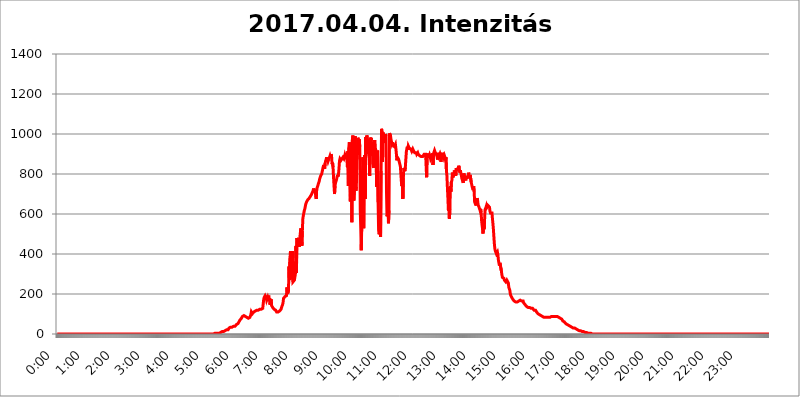
| Category | 2017.04.04. Intenzitás [W/m^2] |
|---|---|
| 0.0 | 0 |
| 0.0006944444444444445 | 0 |
| 0.001388888888888889 | 0 |
| 0.0020833333333333333 | 0 |
| 0.002777777777777778 | 0 |
| 0.003472222222222222 | 0 |
| 0.004166666666666667 | 0 |
| 0.004861111111111111 | 0 |
| 0.005555555555555556 | 0 |
| 0.0062499999999999995 | 0 |
| 0.006944444444444444 | 0 |
| 0.007638888888888889 | 0 |
| 0.008333333333333333 | 0 |
| 0.009027777777777779 | 0 |
| 0.009722222222222222 | 0 |
| 0.010416666666666666 | 0 |
| 0.011111111111111112 | 0 |
| 0.011805555555555555 | 0 |
| 0.012499999999999999 | 0 |
| 0.013194444444444444 | 0 |
| 0.013888888888888888 | 0 |
| 0.014583333333333332 | 0 |
| 0.015277777777777777 | 0 |
| 0.015972222222222224 | 0 |
| 0.016666666666666666 | 0 |
| 0.017361111111111112 | 0 |
| 0.018055555555555557 | 0 |
| 0.01875 | 0 |
| 0.019444444444444445 | 0 |
| 0.02013888888888889 | 0 |
| 0.020833333333333332 | 0 |
| 0.02152777777777778 | 0 |
| 0.022222222222222223 | 0 |
| 0.02291666666666667 | 0 |
| 0.02361111111111111 | 0 |
| 0.024305555555555556 | 0 |
| 0.024999999999999998 | 0 |
| 0.025694444444444447 | 0 |
| 0.02638888888888889 | 0 |
| 0.027083333333333334 | 0 |
| 0.027777777777777776 | 0 |
| 0.02847222222222222 | 0 |
| 0.029166666666666664 | 0 |
| 0.029861111111111113 | 0 |
| 0.030555555555555555 | 0 |
| 0.03125 | 0 |
| 0.03194444444444445 | 0 |
| 0.03263888888888889 | 0 |
| 0.03333333333333333 | 0 |
| 0.034027777777777775 | 0 |
| 0.034722222222222224 | 0 |
| 0.035416666666666666 | 0 |
| 0.036111111111111115 | 0 |
| 0.03680555555555556 | 0 |
| 0.0375 | 0 |
| 0.03819444444444444 | 0 |
| 0.03888888888888889 | 0 |
| 0.03958333333333333 | 0 |
| 0.04027777777777778 | 0 |
| 0.04097222222222222 | 0 |
| 0.041666666666666664 | 0 |
| 0.042361111111111106 | 0 |
| 0.04305555555555556 | 0 |
| 0.043750000000000004 | 0 |
| 0.044444444444444446 | 0 |
| 0.04513888888888889 | 0 |
| 0.04583333333333334 | 0 |
| 0.04652777777777778 | 0 |
| 0.04722222222222222 | 0 |
| 0.04791666666666666 | 0 |
| 0.04861111111111111 | 0 |
| 0.049305555555555554 | 0 |
| 0.049999999999999996 | 0 |
| 0.05069444444444445 | 0 |
| 0.051388888888888894 | 0 |
| 0.052083333333333336 | 0 |
| 0.05277777777777778 | 0 |
| 0.05347222222222222 | 0 |
| 0.05416666666666667 | 0 |
| 0.05486111111111111 | 0 |
| 0.05555555555555555 | 0 |
| 0.05625 | 0 |
| 0.05694444444444444 | 0 |
| 0.057638888888888885 | 0 |
| 0.05833333333333333 | 0 |
| 0.05902777777777778 | 0 |
| 0.059722222222222225 | 0 |
| 0.06041666666666667 | 0 |
| 0.061111111111111116 | 0 |
| 0.06180555555555556 | 0 |
| 0.0625 | 0 |
| 0.06319444444444444 | 0 |
| 0.06388888888888888 | 0 |
| 0.06458333333333334 | 0 |
| 0.06527777777777778 | 0 |
| 0.06597222222222222 | 0 |
| 0.06666666666666667 | 0 |
| 0.06736111111111111 | 0 |
| 0.06805555555555555 | 0 |
| 0.06874999999999999 | 0 |
| 0.06944444444444443 | 0 |
| 0.07013888888888889 | 0 |
| 0.07083333333333333 | 0 |
| 0.07152777777777779 | 0 |
| 0.07222222222222223 | 0 |
| 0.07291666666666667 | 0 |
| 0.07361111111111111 | 0 |
| 0.07430555555555556 | 0 |
| 0.075 | 0 |
| 0.07569444444444444 | 0 |
| 0.0763888888888889 | 0 |
| 0.07708333333333334 | 0 |
| 0.07777777777777778 | 0 |
| 0.07847222222222222 | 0 |
| 0.07916666666666666 | 0 |
| 0.0798611111111111 | 0 |
| 0.08055555555555556 | 0 |
| 0.08125 | 0 |
| 0.08194444444444444 | 0 |
| 0.08263888888888889 | 0 |
| 0.08333333333333333 | 0 |
| 0.08402777777777777 | 0 |
| 0.08472222222222221 | 0 |
| 0.08541666666666665 | 0 |
| 0.08611111111111112 | 0 |
| 0.08680555555555557 | 0 |
| 0.08750000000000001 | 0 |
| 0.08819444444444445 | 0 |
| 0.08888888888888889 | 0 |
| 0.08958333333333333 | 0 |
| 0.09027777777777778 | 0 |
| 0.09097222222222222 | 0 |
| 0.09166666666666667 | 0 |
| 0.09236111111111112 | 0 |
| 0.09305555555555556 | 0 |
| 0.09375 | 0 |
| 0.09444444444444444 | 0 |
| 0.09513888888888888 | 0 |
| 0.09583333333333333 | 0 |
| 0.09652777777777777 | 0 |
| 0.09722222222222222 | 0 |
| 0.09791666666666667 | 0 |
| 0.09861111111111111 | 0 |
| 0.09930555555555555 | 0 |
| 0.09999999999999999 | 0 |
| 0.10069444444444443 | 0 |
| 0.1013888888888889 | 0 |
| 0.10208333333333335 | 0 |
| 0.10277777777777779 | 0 |
| 0.10347222222222223 | 0 |
| 0.10416666666666667 | 0 |
| 0.10486111111111111 | 0 |
| 0.10555555555555556 | 0 |
| 0.10625 | 0 |
| 0.10694444444444444 | 0 |
| 0.1076388888888889 | 0 |
| 0.10833333333333334 | 0 |
| 0.10902777777777778 | 0 |
| 0.10972222222222222 | 0 |
| 0.1111111111111111 | 0 |
| 0.11180555555555556 | 0 |
| 0.11180555555555556 | 0 |
| 0.1125 | 0 |
| 0.11319444444444444 | 0 |
| 0.11388888888888889 | 0 |
| 0.11458333333333333 | 0 |
| 0.11527777777777777 | 0 |
| 0.11597222222222221 | 0 |
| 0.11666666666666665 | 0 |
| 0.1173611111111111 | 0 |
| 0.11805555555555557 | 0 |
| 0.11944444444444445 | 0 |
| 0.12013888888888889 | 0 |
| 0.12083333333333333 | 0 |
| 0.12152777777777778 | 0 |
| 0.12222222222222223 | 0 |
| 0.12291666666666667 | 0 |
| 0.12291666666666667 | 0 |
| 0.12361111111111112 | 0 |
| 0.12430555555555556 | 0 |
| 0.125 | 0 |
| 0.12569444444444444 | 0 |
| 0.12638888888888888 | 0 |
| 0.12708333333333333 | 0 |
| 0.16875 | 0 |
| 0.12847222222222224 | 0 |
| 0.12916666666666668 | 0 |
| 0.12986111111111112 | 0 |
| 0.13055555555555556 | 0 |
| 0.13125 | 0 |
| 0.13194444444444445 | 0 |
| 0.1326388888888889 | 0 |
| 0.13333333333333333 | 0 |
| 0.13402777777777777 | 0 |
| 0.13402777777777777 | 0 |
| 0.13472222222222222 | 0 |
| 0.13541666666666666 | 0 |
| 0.1361111111111111 | 0 |
| 0.13749999999999998 | 0 |
| 0.13819444444444443 | 0 |
| 0.1388888888888889 | 0 |
| 0.13958333333333334 | 0 |
| 0.14027777777777778 | 0 |
| 0.14097222222222222 | 0 |
| 0.14166666666666666 | 0 |
| 0.1423611111111111 | 0 |
| 0.14305555555555557 | 0 |
| 0.14375000000000002 | 0 |
| 0.14444444444444446 | 0 |
| 0.1451388888888889 | 0 |
| 0.1451388888888889 | 0 |
| 0.14652777777777778 | 0 |
| 0.14722222222222223 | 0 |
| 0.14791666666666667 | 0 |
| 0.1486111111111111 | 0 |
| 0.14930555555555555 | 0 |
| 0.15 | 0 |
| 0.15069444444444444 | 0 |
| 0.15138888888888888 | 0 |
| 0.15208333333333332 | 0 |
| 0.15277777777777776 | 0 |
| 0.15347222222222223 | 0 |
| 0.15416666666666667 | 0 |
| 0.15486111111111112 | 0 |
| 0.15555555555555556 | 0 |
| 0.15625 | 0 |
| 0.15694444444444444 | 0 |
| 0.15763888888888888 | 0 |
| 0.15833333333333333 | 0 |
| 0.15902777777777777 | 0 |
| 0.15972222222222224 | 0 |
| 0.16041666666666668 | 0 |
| 0.16111111111111112 | 0 |
| 0.16180555555555556 | 0 |
| 0.1625 | 0 |
| 0.16319444444444445 | 0 |
| 0.1638888888888889 | 0 |
| 0.16458333333333333 | 0 |
| 0.16527777777777777 | 0 |
| 0.16597222222222222 | 0 |
| 0.16666666666666666 | 0 |
| 0.1673611111111111 | 0 |
| 0.16805555555555554 | 0 |
| 0.16874999999999998 | 0 |
| 0.16944444444444443 | 0 |
| 0.17013888888888887 | 0 |
| 0.1708333333333333 | 0 |
| 0.17152777777777775 | 0 |
| 0.17222222222222225 | 0 |
| 0.1729166666666667 | 0 |
| 0.17361111111111113 | 0 |
| 0.17430555555555557 | 0 |
| 0.17500000000000002 | 0 |
| 0.17569444444444446 | 0 |
| 0.1763888888888889 | 0 |
| 0.17708333333333334 | 0 |
| 0.17777777777777778 | 0 |
| 0.17847222222222223 | 0 |
| 0.17916666666666667 | 0 |
| 0.1798611111111111 | 0 |
| 0.18055555555555555 | 0 |
| 0.18125 | 0 |
| 0.18194444444444444 | 0 |
| 0.1826388888888889 | 0 |
| 0.18333333333333335 | 0 |
| 0.1840277777777778 | 0 |
| 0.18472222222222223 | 0 |
| 0.18541666666666667 | 0 |
| 0.18611111111111112 | 0 |
| 0.18680555555555556 | 0 |
| 0.1875 | 0 |
| 0.18819444444444444 | 0 |
| 0.18888888888888888 | 0 |
| 0.18958333333333333 | 0 |
| 0.19027777777777777 | 0 |
| 0.1909722222222222 | 0 |
| 0.19166666666666665 | 0 |
| 0.19236111111111112 | 0 |
| 0.19305555555555554 | 0 |
| 0.19375 | 0 |
| 0.19444444444444445 | 0 |
| 0.1951388888888889 | 0 |
| 0.19583333333333333 | 0 |
| 0.19652777777777777 | 0 |
| 0.19722222222222222 | 0 |
| 0.19791666666666666 | 0 |
| 0.1986111111111111 | 0 |
| 0.19930555555555554 | 0 |
| 0.19999999999999998 | 0 |
| 0.20069444444444443 | 0 |
| 0.20138888888888887 | 0 |
| 0.2020833333333333 | 0 |
| 0.2027777777777778 | 0 |
| 0.2034722222222222 | 0 |
| 0.2041666666666667 | 0 |
| 0.20486111111111113 | 0 |
| 0.20555555555555557 | 0 |
| 0.20625000000000002 | 0 |
| 0.20694444444444446 | 0 |
| 0.2076388888888889 | 0 |
| 0.20833333333333334 | 0 |
| 0.20902777777777778 | 0 |
| 0.20972222222222223 | 0 |
| 0.21041666666666667 | 0 |
| 0.2111111111111111 | 0 |
| 0.21180555555555555 | 0 |
| 0.2125 | 0 |
| 0.21319444444444444 | 0 |
| 0.2138888888888889 | 0 |
| 0.21458333333333335 | 0 |
| 0.2152777777777778 | 0 |
| 0.21597222222222223 | 0 |
| 0.21666666666666667 | 0 |
| 0.21736111111111112 | 0 |
| 0.21805555555555556 | 0 |
| 0.21875 | 0 |
| 0.21944444444444444 | 0 |
| 0.22013888888888888 | 3.525 |
| 0.22083333333333333 | 3.525 |
| 0.22152777777777777 | 3.525 |
| 0.2222222222222222 | 3.525 |
| 0.22291666666666665 | 3.525 |
| 0.2236111111111111 | 3.525 |
| 0.22430555555555556 | 3.525 |
| 0.225 | 3.525 |
| 0.22569444444444445 | 3.525 |
| 0.2263888888888889 | 3.525 |
| 0.22708333333333333 | 3.525 |
| 0.22777777777777777 | 3.525 |
| 0.22847222222222222 | 7.887 |
| 0.22916666666666666 | 7.887 |
| 0.2298611111111111 | 7.887 |
| 0.23055555555555554 | 12.257 |
| 0.23124999999999998 | 12.257 |
| 0.23194444444444443 | 12.257 |
| 0.23263888888888887 | 12.257 |
| 0.2333333333333333 | 12.257 |
| 0.2340277777777778 | 12.257 |
| 0.2347222222222222 | 16.636 |
| 0.2354166666666667 | 16.636 |
| 0.23611111111111113 | 16.636 |
| 0.23680555555555557 | 16.636 |
| 0.23750000000000002 | 21.024 |
| 0.23819444444444446 | 21.024 |
| 0.2388888888888889 | 21.024 |
| 0.23958333333333334 | 21.024 |
| 0.24027777777777778 | 25.419 |
| 0.24097222222222223 | 29.823 |
| 0.24166666666666667 | 29.823 |
| 0.2423611111111111 | 29.823 |
| 0.24305555555555555 | 34.234 |
| 0.24375 | 34.234 |
| 0.24444444444444446 | 34.234 |
| 0.24513888888888888 | 34.234 |
| 0.24583333333333335 | 34.234 |
| 0.2465277777777778 | 38.653 |
| 0.24722222222222223 | 38.653 |
| 0.24791666666666667 | 38.653 |
| 0.24861111111111112 | 38.653 |
| 0.24930555555555556 | 38.653 |
| 0.25 | 43.079 |
| 0.25069444444444444 | 43.079 |
| 0.2513888888888889 | 47.511 |
| 0.2520833333333333 | 47.511 |
| 0.25277777777777777 | 51.951 |
| 0.2534722222222222 | 51.951 |
| 0.25416666666666665 | 56.398 |
| 0.2548611111111111 | 60.85 |
| 0.2555555555555556 | 65.31 |
| 0.25625000000000003 | 69.775 |
| 0.2569444444444445 | 74.246 |
| 0.2576388888888889 | 74.246 |
| 0.25833333333333336 | 78.722 |
| 0.2590277777777778 | 83.205 |
| 0.25972222222222224 | 87.692 |
| 0.2604166666666667 | 87.692 |
| 0.2611111111111111 | 92.184 |
| 0.26180555555555557 | 92.184 |
| 0.2625 | 92.184 |
| 0.26319444444444445 | 92.184 |
| 0.2638888888888889 | 87.692 |
| 0.26458333333333334 | 87.692 |
| 0.2652777777777778 | 83.205 |
| 0.2659722222222222 | 83.205 |
| 0.26666666666666666 | 83.205 |
| 0.2673611111111111 | 83.205 |
| 0.26805555555555555 | 78.722 |
| 0.26875 | 78.722 |
| 0.26944444444444443 | 83.205 |
| 0.2701388888888889 | 83.205 |
| 0.2708333333333333 | 87.692 |
| 0.27152777777777776 | 96.682 |
| 0.2722222222222222 | 110.201 |
| 0.27291666666666664 | 105.69 |
| 0.2736111111111111 | 101.184 |
| 0.2743055555555555 | 101.184 |
| 0.27499999999999997 | 105.69 |
| 0.27569444444444446 | 110.201 |
| 0.27638888888888885 | 110.201 |
| 0.27708333333333335 | 114.716 |
| 0.2777777777777778 | 114.716 |
| 0.27847222222222223 | 114.716 |
| 0.2791666666666667 | 119.235 |
| 0.2798611111111111 | 119.235 |
| 0.28055555555555556 | 119.235 |
| 0.28125 | 119.235 |
| 0.28194444444444444 | 119.235 |
| 0.2826388888888889 | 119.235 |
| 0.2833333333333333 | 119.235 |
| 0.28402777777777777 | 123.758 |
| 0.2847222222222222 | 119.235 |
| 0.28541666666666665 | 119.235 |
| 0.28611111111111115 | 123.758 |
| 0.28680555555555554 | 123.758 |
| 0.28750000000000003 | 128.284 |
| 0.2881944444444445 | 128.284 |
| 0.2888888888888889 | 132.814 |
| 0.28958333333333336 | 173.709 |
| 0.2902777777777778 | 182.82 |
| 0.29097222222222224 | 187.378 |
| 0.2916666666666667 | 191.937 |
| 0.2923611111111111 | 191.937 |
| 0.29305555555555557 | 182.82 |
| 0.29375 | 169.156 |
| 0.29444444444444445 | 169.156 |
| 0.2951388888888889 | 182.82 |
| 0.29583333333333334 | 173.709 |
| 0.2965277777777778 | 191.937 |
| 0.2972222222222222 | 164.605 |
| 0.29791666666666666 | 178.264 |
| 0.2986111111111111 | 146.423 |
| 0.29930555555555555 | 164.605 |
| 0.3 | 173.709 |
| 0.30069444444444443 | 141.884 |
| 0.3013888888888889 | 137.347 |
| 0.3020833333333333 | 132.814 |
| 0.30277777777777776 | 128.284 |
| 0.3034722222222222 | 128.284 |
| 0.30416666666666664 | 123.758 |
| 0.3048611111111111 | 119.235 |
| 0.3055555555555555 | 119.235 |
| 0.30624999999999997 | 119.235 |
| 0.3069444444444444 | 114.716 |
| 0.3076388888888889 | 110.201 |
| 0.30833333333333335 | 110.201 |
| 0.3090277777777778 | 110.201 |
| 0.30972222222222223 | 110.201 |
| 0.3104166666666667 | 110.201 |
| 0.3111111111111111 | 110.201 |
| 0.31180555555555556 | 114.716 |
| 0.3125 | 114.716 |
| 0.31319444444444444 | 119.235 |
| 0.3138888888888889 | 123.758 |
| 0.3145833333333333 | 132.814 |
| 0.31527777777777777 | 137.347 |
| 0.3159722222222222 | 146.423 |
| 0.31666666666666665 | 155.509 |
| 0.31736111111111115 | 178.264 |
| 0.31805555555555554 | 173.709 |
| 0.31875000000000003 | 178.264 |
| 0.3194444444444445 | 187.378 |
| 0.3201388888888889 | 187.378 |
| 0.32083333333333336 | 187.378 |
| 0.3215277777777778 | 191.937 |
| 0.32222222222222224 | 233 |
| 0.3229166666666667 | 201.058 |
| 0.3236111111111111 | 205.62 |
| 0.32430555555555557 | 214.746 |
| 0.325 | 337.639 |
| 0.32569444444444445 | 269.49 |
| 0.3263888888888889 | 378.224 |
| 0.32708333333333334 | 414.035 |
| 0.3277777777777778 | 409.574 |
| 0.3284722222222222 | 274.047 |
| 0.32916666666666666 | 274.047 |
| 0.3298611111111111 | 414.035 |
| 0.33055555555555555 | 260.373 |
| 0.33125 | 264.932 |
| 0.33194444444444443 | 255.813 |
| 0.3326388888888889 | 269.49 |
| 0.3333333333333333 | 269.49 |
| 0.3340277777777778 | 301.354 |
| 0.3347222222222222 | 440.702 |
| 0.3354166666666667 | 305.898 |
| 0.3361111111111111 | 480.356 |
| 0.3368055555555556 | 480.356 |
| 0.33749999999999997 | 484.735 |
| 0.33819444444444446 | 458.38 |
| 0.33888888888888885 | 458.38 |
| 0.33958333333333335 | 436.27 |
| 0.34027777777777773 | 480.356 |
| 0.34097222222222223 | 506.542 |
| 0.3416666666666666 | 528.2 |
| 0.3423611111111111 | 532.513 |
| 0.3430555555555555 | 440.702 |
| 0.34375 | 515.223 |
| 0.3444444444444445 | 575.299 |
| 0.3451388888888889 | 592.233 |
| 0.3458333333333334 | 604.864 |
| 0.34652777777777777 | 617.436 |
| 0.34722222222222227 | 625.784 |
| 0.34791666666666665 | 625.784 |
| 0.34861111111111115 | 650.667 |
| 0.34930555555555554 | 654.791 |
| 0.35000000000000003 | 663.019 |
| 0.3506944444444444 | 667.123 |
| 0.3513888888888889 | 671.22 |
| 0.3520833333333333 | 671.22 |
| 0.3527777777777778 | 675.311 |
| 0.3534722222222222 | 679.395 |
| 0.3541666666666667 | 675.311 |
| 0.3548611111111111 | 687.544 |
| 0.35555555555555557 | 691.608 |
| 0.35625 | 695.666 |
| 0.35694444444444445 | 699.717 |
| 0.3576388888888889 | 699.717 |
| 0.35833333333333334 | 711.832 |
| 0.3590277777777778 | 711.832 |
| 0.3597222222222222 | 727.896 |
| 0.36041666666666666 | 715.858 |
| 0.3611111111111111 | 711.832 |
| 0.36180555555555555 | 707.8 |
| 0.3625 | 703.762 |
| 0.36319444444444443 | 675.311 |
| 0.3638888888888889 | 723.889 |
| 0.3645833333333333 | 727.896 |
| 0.3652777777777778 | 739.877 |
| 0.3659722222222222 | 747.834 |
| 0.3666666666666667 | 755.766 |
| 0.3673611111111111 | 763.674 |
| 0.3680555555555556 | 775.492 |
| 0.36874999999999997 | 783.342 |
| 0.36944444444444446 | 791.169 |
| 0.37013888888888885 | 795.074 |
| 0.37083333333333335 | 798.974 |
| 0.37152777777777773 | 810.641 |
| 0.37222222222222223 | 806.757 |
| 0.3729166666666666 | 833.834 |
| 0.3736111111111111 | 845.365 |
| 0.3743055555555555 | 837.682 |
| 0.375 | 826.123 |
| 0.3756944444444445 | 853.029 |
| 0.3763888888888889 | 864.493 |
| 0.3770833333333334 | 872.114 |
| 0.37777777777777777 | 883.516 |
| 0.37847222222222227 | 864.493 |
| 0.37916666666666665 | 875.918 |
| 0.37986111111111115 | 864.493 |
| 0.38055555555555554 | 872.114 |
| 0.38125000000000003 | 868.305 |
| 0.3819444444444444 | 883.516 |
| 0.3826388888888889 | 891.099 |
| 0.3833333333333333 | 883.516 |
| 0.3840277777777778 | 898.668 |
| 0.3847222222222222 | 891.099 |
| 0.3854166666666667 | 849.199 |
| 0.3861111111111111 | 856.855 |
| 0.38680555555555557 | 833.834 |
| 0.3875 | 783.342 |
| 0.38819444444444445 | 783.342 |
| 0.3888888888888889 | 699.717 |
| 0.38958333333333334 | 739.877 |
| 0.3902777777777778 | 755.766 |
| 0.3909722222222222 | 759.723 |
| 0.39166666666666666 | 771.559 |
| 0.3923611111111111 | 767.62 |
| 0.39305555555555555 | 795.074 |
| 0.39375 | 787.258 |
| 0.39444444444444443 | 798.974 |
| 0.3951388888888889 | 826.123 |
| 0.3958333333333333 | 864.493 |
| 0.3965277777777778 | 875.918 |
| 0.3972222222222222 | 875.918 |
| 0.3979166666666667 | 868.305 |
| 0.3986111111111111 | 872.114 |
| 0.3993055555555556 | 875.918 |
| 0.39999999999999997 | 872.114 |
| 0.40069444444444446 | 883.516 |
| 0.40138888888888885 | 883.516 |
| 0.40208333333333335 | 875.918 |
| 0.40277777777777773 | 883.516 |
| 0.40347222222222223 | 894.885 |
| 0.4041666666666666 | 887.309 |
| 0.4048611111111111 | 883.516 |
| 0.4055555555555555 | 883.516 |
| 0.40625 | 875.918 |
| 0.4069444444444445 | 833.834 |
| 0.4076388888888889 | 913.766 |
| 0.4083333333333334 | 739.877 |
| 0.40902777777777777 | 932.576 |
| 0.40972222222222227 | 958.814 |
| 0.41041666666666665 | 962.555 |
| 0.41111111111111115 | 663.019 |
| 0.41180555555555554 | 837.682 |
| 0.41250000000000003 | 810.641 |
| 0.4131944444444444 | 558.261 |
| 0.4138888888888889 | 970.034 |
| 0.4145833333333333 | 992.448 |
| 0.4152777777777778 | 966.295 |
| 0.4159722222222222 | 667.123 |
| 0.4166666666666667 | 715.858 |
| 0.4173611111111111 | 955.071 |
| 0.41805555555555557 | 988.714 |
| 0.41875 | 715.858 |
| 0.41944444444444445 | 735.89 |
| 0.4201388888888889 | 868.305 |
| 0.42083333333333334 | 879.719 |
| 0.4215277777777778 | 981.244 |
| 0.4222222222222222 | 973.772 |
| 0.42291666666666666 | 943.832 |
| 0.4236111111111111 | 973.772 |
| 0.42430555555555555 | 936.33 |
| 0.425 | 617.436 |
| 0.42569444444444443 | 528.2 |
| 0.4263888888888889 | 418.492 |
| 0.4270833333333333 | 545.416 |
| 0.4277777777777778 | 735.89 |
| 0.4284722222222222 | 883.516 |
| 0.4291666666666667 | 849.199 |
| 0.4298611111111111 | 528.2 |
| 0.4305555555555556 | 860.676 |
| 0.43124999999999997 | 894.885 |
| 0.43194444444444446 | 675.311 |
| 0.43263888888888885 | 984.98 |
| 0.43333333333333335 | 902.447 |
| 0.43402777777777773 | 992.448 |
| 0.43472222222222223 | 984.98 |
| 0.4354166666666666 | 988.714 |
| 0.4361111111111111 | 988.714 |
| 0.4368055555555555 | 894.885 |
| 0.4375 | 879.719 |
| 0.4381944444444445 | 791.169 |
| 0.4388888888888889 | 981.244 |
| 0.4395833333333334 | 970.034 |
| 0.44027777777777777 | 981.244 |
| 0.44097222222222227 | 891.099 |
| 0.44166666666666665 | 891.099 |
| 0.44236111111111115 | 958.814 |
| 0.44305555555555554 | 845.365 |
| 0.44375000000000003 | 829.981 |
| 0.4444444444444444 | 909.996 |
| 0.4451388888888889 | 970.034 |
| 0.4458333333333333 | 932.576 |
| 0.4465277777777778 | 925.06 |
| 0.4472222222222222 | 887.309 |
| 0.4479166666666667 | 735.89 |
| 0.4486111111111111 | 841.526 |
| 0.44930555555555557 | 917.534 |
| 0.45 | 658.909 |
| 0.45069444444444445 | 519.555 |
| 0.4513888888888889 | 497.836 |
| 0.45208333333333334 | 506.542 |
| 0.4527777777777778 | 592.233 |
| 0.4534722222222222 | 484.735 |
| 0.45416666666666666 | 814.519 |
| 0.4548611111111111 | 1026.06 |
| 0.45555555555555555 | 1007.383 |
| 0.45625 | 860.676 |
| 0.45694444444444443 | 1007.383 |
| 0.4576388888888889 | 984.98 |
| 0.4583333333333333 | 996.182 |
| 0.4590277777777778 | 966.295 |
| 0.4597222222222222 | 955.071 |
| 0.4604166666666667 | 999.916 |
| 0.4611111111111111 | 988.714 |
| 0.4618055555555556 | 707.8 |
| 0.46249999999999997 | 588.009 |
| 0.46319444444444446 | 596.45 |
| 0.46388888888888885 | 711.832 |
| 0.46458333333333335 | 553.986 |
| 0.46527777777777773 | 617.436 |
| 0.46597222222222223 | 1003.65 |
| 0.4666666666666666 | 1007.383 |
| 0.4673611111111111 | 992.448 |
| 0.4680555555555555 | 973.772 |
| 0.46875 | 970.034 |
| 0.4694444444444445 | 951.327 |
| 0.4701388888888889 | 958.814 |
| 0.4708333333333334 | 943.832 |
| 0.47152777777777777 | 943.832 |
| 0.47222222222222227 | 943.832 |
| 0.47291666666666665 | 936.33 |
| 0.47361111111111115 | 940.082 |
| 0.47430555555555554 | 947.58 |
| 0.47500000000000003 | 925.06 |
| 0.4756944444444444 | 898.668 |
| 0.4763888888888889 | 868.305 |
| 0.4770833333333333 | 883.516 |
| 0.4777777777777778 | 883.516 |
| 0.4784722222222222 | 875.918 |
| 0.4791666666666667 | 868.305 |
| 0.4798611111111111 | 864.493 |
| 0.48055555555555557 | 868.305 |
| 0.48125 | 837.682 |
| 0.48194444444444445 | 833.834 |
| 0.4826388888888889 | 763.674 |
| 0.48333333333333334 | 739.877 |
| 0.4840277777777778 | 806.757 |
| 0.4847222222222222 | 675.311 |
| 0.48541666666666666 | 783.342 |
| 0.4861111111111111 | 829.981 |
| 0.48680555555555555 | 822.26 |
| 0.4875 | 814.519 |
| 0.48819444444444443 | 833.834 |
| 0.4888888888888889 | 872.114 |
| 0.4895833333333333 | 909.996 |
| 0.4902777777777778 | 925.06 |
| 0.4909722222222222 | 936.33 |
| 0.4916666666666667 | 921.298 |
| 0.4923611111111111 | 940.082 |
| 0.4930555555555556 | 936.33 |
| 0.49374999999999997 | 928.819 |
| 0.49444444444444446 | 932.576 |
| 0.49513888888888885 | 925.06 |
| 0.49583333333333335 | 925.06 |
| 0.49652777777777773 | 921.298 |
| 0.49722222222222223 | 913.766 |
| 0.4979166666666666 | 917.534 |
| 0.4986111111111111 | 925.06 |
| 0.4993055555555555 | 921.298 |
| 0.5 | 913.766 |
| 0.5006944444444444 | 909.996 |
| 0.5013888888888889 | 906.223 |
| 0.5020833333333333 | 909.996 |
| 0.5027777777777778 | 909.996 |
| 0.5034722222222222 | 906.223 |
| 0.5041666666666667 | 898.668 |
| 0.5048611111111111 | 898.668 |
| 0.5055555555555555 | 906.223 |
| 0.50625 | 898.668 |
| 0.5069444444444444 | 898.668 |
| 0.5076388888888889 | 894.885 |
| 0.5083333333333333 | 891.099 |
| 0.5090277777777777 | 894.885 |
| 0.5097222222222222 | 887.309 |
| 0.5104166666666666 | 887.309 |
| 0.5111111111111112 | 887.309 |
| 0.5118055555555555 | 891.099 |
| 0.5125000000000001 | 887.309 |
| 0.5131944444444444 | 887.309 |
| 0.513888888888889 | 891.099 |
| 0.5145833333333333 | 898.668 |
| 0.5152777777777778 | 894.885 |
| 0.5159722222222222 | 894.885 |
| 0.5166666666666667 | 898.668 |
| 0.517361111111111 | 894.885 |
| 0.5180555555555556 | 783.342 |
| 0.5187499999999999 | 902.447 |
| 0.5194444444444445 | 887.309 |
| 0.5201388888888888 | 883.516 |
| 0.5208333333333334 | 883.516 |
| 0.5215277777777778 | 887.309 |
| 0.5222222222222223 | 894.885 |
| 0.5229166666666667 | 887.309 |
| 0.5236111111111111 | 875.918 |
| 0.5243055555555556 | 872.114 |
| 0.525 | 887.309 |
| 0.5256944444444445 | 891.099 |
| 0.5263888888888889 | 902.447 |
| 0.5270833333333333 | 845.365 |
| 0.5277777777777778 | 902.447 |
| 0.5284722222222222 | 909.996 |
| 0.5291666666666667 | 917.534 |
| 0.5298611111111111 | 909.996 |
| 0.5305555555555556 | 906.223 |
| 0.53125 | 906.223 |
| 0.5319444444444444 | 894.885 |
| 0.5326388888888889 | 887.309 |
| 0.5333333333333333 | 872.114 |
| 0.5340277777777778 | 887.309 |
| 0.5347222222222222 | 906.223 |
| 0.5354166666666667 | 891.099 |
| 0.5361111111111111 | 894.885 |
| 0.5368055555555555 | 902.447 |
| 0.5375 | 894.885 |
| 0.5381944444444444 | 860.676 |
| 0.5388888888888889 | 894.885 |
| 0.5395833333333333 | 906.223 |
| 0.5402777777777777 | 887.309 |
| 0.5409722222222222 | 883.516 |
| 0.5416666666666666 | 894.885 |
| 0.5423611111111112 | 883.516 |
| 0.5430555555555555 | 891.099 |
| 0.5437500000000001 | 883.516 |
| 0.5444444444444444 | 868.305 |
| 0.545138888888889 | 883.516 |
| 0.5458333333333333 | 818.392 |
| 0.5465277777777778 | 791.169 |
| 0.5472222222222222 | 731.896 |
| 0.5479166666666667 | 679.395 |
| 0.548611111111111 | 617.436 |
| 0.5493055555555556 | 650.667 |
| 0.5499999999999999 | 575.299 |
| 0.5506944444444445 | 621.613 |
| 0.5513888888888888 | 739.877 |
| 0.5520833333333334 | 711.832 |
| 0.5527777777777778 | 759.723 |
| 0.5534722222222223 | 767.62 |
| 0.5541666666666667 | 806.757 |
| 0.5548611111111111 | 783.342 |
| 0.5555555555555556 | 791.169 |
| 0.55625 | 798.974 |
| 0.5569444444444445 | 818.392 |
| 0.5576388888888889 | 810.641 |
| 0.5583333333333333 | 798.974 |
| 0.5590277777777778 | 791.169 |
| 0.5597222222222222 | 829.981 |
| 0.5604166666666667 | 822.26 |
| 0.5611111111111111 | 826.123 |
| 0.5618055555555556 | 818.392 |
| 0.5625 | 829.981 |
| 0.5631944444444444 | 841.526 |
| 0.5638888888888889 | 826.123 |
| 0.5645833333333333 | 806.757 |
| 0.5652777777777778 | 818.392 |
| 0.5659722222222222 | 806.757 |
| 0.5666666666666667 | 795.074 |
| 0.5673611111111111 | 779.42 |
| 0.5680555555555555 | 771.559 |
| 0.56875 | 775.492 |
| 0.5694444444444444 | 755.766 |
| 0.5701388888888889 | 802.868 |
| 0.5708333333333333 | 806.757 |
| 0.5715277777777777 | 783.342 |
| 0.5722222222222222 | 775.492 |
| 0.5729166666666666 | 767.62 |
| 0.5736111111111112 | 787.258 |
| 0.5743055555555555 | 775.492 |
| 0.5750000000000001 | 791.169 |
| 0.5756944444444444 | 779.42 |
| 0.576388888888889 | 791.169 |
| 0.5770833333333333 | 806.757 |
| 0.5777777777777778 | 779.42 |
| 0.5784722222222222 | 783.342 |
| 0.5791666666666667 | 795.074 |
| 0.579861111111111 | 795.074 |
| 0.5805555555555556 | 759.723 |
| 0.5812499999999999 | 747.834 |
| 0.5819444444444445 | 735.89 |
| 0.5826388888888888 | 731.896 |
| 0.5833333333333334 | 719.877 |
| 0.5840277777777778 | 739.877 |
| 0.5847222222222223 | 711.832 |
| 0.5854166666666667 | 658.909 |
| 0.5861111111111111 | 658.909 |
| 0.5868055555555556 | 658.909 |
| 0.5875 | 642.4 |
| 0.5881944444444445 | 671.22 |
| 0.5888888888888889 | 679.395 |
| 0.5895833333333333 | 667.123 |
| 0.5902777777777778 | 646.537 |
| 0.5909722222222222 | 642.4 |
| 0.5916666666666667 | 642.4 |
| 0.5923611111111111 | 625.784 |
| 0.5930555555555556 | 617.436 |
| 0.59375 | 625.784 |
| 0.5944444444444444 | 609.062 |
| 0.5951388888888889 | 566.793 |
| 0.5958333333333333 | 545.416 |
| 0.5965277777777778 | 545.416 |
| 0.5972222222222222 | 502.192 |
| 0.5979166666666667 | 566.793 |
| 0.5986111111111111 | 523.88 |
| 0.5993055555555555 | 566.793 |
| 0.6 | 621.613 |
| 0.6006944444444444 | 621.613 |
| 0.6013888888888889 | 634.105 |
| 0.6020833333333333 | 642.4 |
| 0.6027777777777777 | 634.105 |
| 0.6034722222222222 | 638.256 |
| 0.6041666666666666 | 642.4 |
| 0.6048611111111112 | 646.537 |
| 0.6055555555555555 | 638.256 |
| 0.6062500000000001 | 634.105 |
| 0.6069444444444444 | 613.252 |
| 0.607638888888889 | 604.864 |
| 0.6083333333333333 | 609.062 |
| 0.6090277777777778 | 600.661 |
| 0.6097222222222222 | 604.864 |
| 0.6104166666666667 | 575.299 |
| 0.611111111111111 | 549.704 |
| 0.6118055555555556 | 519.555 |
| 0.6124999999999999 | 480.356 |
| 0.6131944444444445 | 445.129 |
| 0.6138888888888888 | 422.943 |
| 0.6145833333333334 | 414.035 |
| 0.6152777777777778 | 409.574 |
| 0.6159722222222223 | 400.638 |
| 0.6166666666666667 | 405.108 |
| 0.6173611111111111 | 409.574 |
| 0.6180555555555556 | 396.164 |
| 0.61875 | 369.23 |
| 0.6194444444444445 | 364.728 |
| 0.6201388888888889 | 342.162 |
| 0.6208333333333333 | 355.712 |
| 0.6215277777777778 | 351.198 |
| 0.6222222222222222 | 351.198 |
| 0.6229166666666667 | 314.98 |
| 0.6236111111111111 | 296.808 |
| 0.6243055555555556 | 283.156 |
| 0.625 | 283.156 |
| 0.6256944444444444 | 287.709 |
| 0.6263888888888889 | 278.603 |
| 0.6270833333333333 | 269.49 |
| 0.6277777777777778 | 264.932 |
| 0.6284722222222222 | 264.932 |
| 0.6291666666666667 | 260.373 |
| 0.6298611111111111 | 255.813 |
| 0.6305555555555555 | 269.49 |
| 0.63125 | 274.047 |
| 0.6319444444444444 | 264.932 |
| 0.6326388888888889 | 255.813 |
| 0.6333333333333333 | 233 |
| 0.6340277777777777 | 228.436 |
| 0.6347222222222222 | 219.309 |
| 0.6354166666666666 | 201.058 |
| 0.6361111111111112 | 191.937 |
| 0.6368055555555555 | 187.378 |
| 0.6375000000000001 | 182.82 |
| 0.6381944444444444 | 178.264 |
| 0.638888888888889 | 173.709 |
| 0.6395833333333333 | 173.709 |
| 0.6402777777777778 | 169.156 |
| 0.6409722222222222 | 164.605 |
| 0.6416666666666667 | 164.605 |
| 0.642361111111111 | 160.056 |
| 0.6430555555555556 | 160.056 |
| 0.6437499999999999 | 160.056 |
| 0.6444444444444445 | 160.056 |
| 0.6451388888888888 | 160.056 |
| 0.6458333333333334 | 160.056 |
| 0.6465277777777778 | 160.056 |
| 0.6472222222222223 | 164.605 |
| 0.6479166666666667 | 164.605 |
| 0.6486111111111111 | 160.056 |
| 0.6493055555555556 | 169.156 |
| 0.65 | 164.605 |
| 0.6506944444444445 | 164.605 |
| 0.6513888888888889 | 164.605 |
| 0.6520833333333333 | 164.605 |
| 0.6527777777777778 | 164.605 |
| 0.6534722222222222 | 164.605 |
| 0.6541666666666667 | 155.509 |
| 0.6548611111111111 | 155.509 |
| 0.6555555555555556 | 150.964 |
| 0.65625 | 146.423 |
| 0.6569444444444444 | 146.423 |
| 0.6576388888888889 | 141.884 |
| 0.6583333333333333 | 137.347 |
| 0.6590277777777778 | 137.347 |
| 0.6597222222222222 | 137.347 |
| 0.6604166666666667 | 132.814 |
| 0.6611111111111111 | 132.814 |
| 0.6618055555555555 | 132.814 |
| 0.6625 | 132.814 |
| 0.6631944444444444 | 132.814 |
| 0.6638888888888889 | 132.814 |
| 0.6645833333333333 | 128.284 |
| 0.6652777777777777 | 128.284 |
| 0.6659722222222222 | 128.284 |
| 0.6666666666666666 | 128.284 |
| 0.6673611111111111 | 128.284 |
| 0.6680555555555556 | 128.284 |
| 0.6687500000000001 | 119.235 |
| 0.6694444444444444 | 123.758 |
| 0.6701388888888888 | 119.235 |
| 0.6708333333333334 | 119.235 |
| 0.6715277777777778 | 114.716 |
| 0.6722222222222222 | 110.201 |
| 0.6729166666666666 | 110.201 |
| 0.6736111111111112 | 110.201 |
| 0.6743055555555556 | 101.184 |
| 0.6749999999999999 | 101.184 |
| 0.6756944444444444 | 101.184 |
| 0.6763888888888889 | 96.682 |
| 0.6770833333333334 | 92.184 |
| 0.6777777777777777 | 92.184 |
| 0.6784722222222223 | 92.184 |
| 0.6791666666666667 | 92.184 |
| 0.6798611111111111 | 87.692 |
| 0.6805555555555555 | 87.692 |
| 0.68125 | 87.692 |
| 0.6819444444444445 | 87.692 |
| 0.6826388888888889 | 83.205 |
| 0.6833333333333332 | 83.205 |
| 0.6840277777777778 | 83.205 |
| 0.6847222222222222 | 83.205 |
| 0.6854166666666667 | 83.205 |
| 0.686111111111111 | 83.205 |
| 0.6868055555555556 | 83.205 |
| 0.6875 | 83.205 |
| 0.6881944444444444 | 83.205 |
| 0.688888888888889 | 83.205 |
| 0.6895833333333333 | 83.205 |
| 0.6902777777777778 | 83.205 |
| 0.6909722222222222 | 83.205 |
| 0.6916666666666668 | 83.205 |
| 0.6923611111111111 | 87.692 |
| 0.6930555555555555 | 87.692 |
| 0.69375 | 87.692 |
| 0.6944444444444445 | 87.692 |
| 0.6951388888888889 | 87.692 |
| 0.6958333333333333 | 87.692 |
| 0.6965277777777777 | 87.692 |
| 0.6972222222222223 | 87.692 |
| 0.6979166666666666 | 87.692 |
| 0.6986111111111111 | 87.692 |
| 0.6993055555555556 | 87.692 |
| 0.7000000000000001 | 87.692 |
| 0.7006944444444444 | 87.692 |
| 0.7013888888888888 | 87.692 |
| 0.7020833333333334 | 83.205 |
| 0.7027777777777778 | 83.205 |
| 0.7034722222222222 | 83.205 |
| 0.7041666666666666 | 83.205 |
| 0.7048611111111112 | 78.722 |
| 0.7055555555555556 | 78.722 |
| 0.7062499999999999 | 78.722 |
| 0.7069444444444444 | 74.246 |
| 0.7076388888888889 | 74.246 |
| 0.7083333333333334 | 69.775 |
| 0.7090277777777777 | 65.31 |
| 0.7097222222222223 | 65.31 |
| 0.7104166666666667 | 60.85 |
| 0.7111111111111111 | 60.85 |
| 0.7118055555555555 | 56.398 |
| 0.7125 | 56.398 |
| 0.7131944444444445 | 51.951 |
| 0.7138888888888889 | 51.951 |
| 0.7145833333333332 | 51.951 |
| 0.7152777777777778 | 47.511 |
| 0.7159722222222222 | 47.511 |
| 0.7166666666666667 | 43.079 |
| 0.717361111111111 | 43.079 |
| 0.7180555555555556 | 43.079 |
| 0.71875 | 38.653 |
| 0.7194444444444444 | 38.653 |
| 0.720138888888889 | 38.653 |
| 0.7208333333333333 | 38.653 |
| 0.7215277777777778 | 34.234 |
| 0.7222222222222222 | 34.234 |
| 0.7229166666666668 | 34.234 |
| 0.7236111111111111 | 29.823 |
| 0.7243055555555555 | 29.823 |
| 0.725 | 29.823 |
| 0.7256944444444445 | 29.823 |
| 0.7263888888888889 | 29.823 |
| 0.7270833333333333 | 25.419 |
| 0.7277777777777777 | 25.419 |
| 0.7284722222222223 | 25.419 |
| 0.7291666666666666 | 21.024 |
| 0.7298611111111111 | 21.024 |
| 0.7305555555555556 | 21.024 |
| 0.7312500000000001 | 21.024 |
| 0.7319444444444444 | 16.636 |
| 0.7326388888888888 | 16.636 |
| 0.7333333333333334 | 16.636 |
| 0.7340277777777778 | 16.636 |
| 0.7347222222222222 | 16.636 |
| 0.7354166666666666 | 12.257 |
| 0.7361111111111112 | 12.257 |
| 0.7368055555555556 | 12.257 |
| 0.7374999999999999 | 12.257 |
| 0.7381944444444444 | 12.257 |
| 0.7388888888888889 | 12.257 |
| 0.7395833333333334 | 7.887 |
| 0.7402777777777777 | 7.887 |
| 0.7409722222222223 | 7.887 |
| 0.7416666666666667 | 7.887 |
| 0.7423611111111111 | 7.887 |
| 0.7430555555555555 | 3.525 |
| 0.74375 | 3.525 |
| 0.7444444444444445 | 3.525 |
| 0.7451388888888889 | 3.525 |
| 0.7458333333333332 | 3.525 |
| 0.7465277777777778 | 3.525 |
| 0.7472222222222222 | 3.525 |
| 0.7479166666666667 | 3.525 |
| 0.748611111111111 | 3.525 |
| 0.7493055555555556 | 0 |
| 0.75 | 0 |
| 0.7506944444444444 | 0 |
| 0.751388888888889 | 0 |
| 0.7520833333333333 | 0 |
| 0.7527777777777778 | 0 |
| 0.7534722222222222 | 0 |
| 0.7541666666666668 | 0 |
| 0.7548611111111111 | 0 |
| 0.7555555555555555 | 0 |
| 0.75625 | 0 |
| 0.7569444444444445 | 0 |
| 0.7576388888888889 | 0 |
| 0.7583333333333333 | 0 |
| 0.7590277777777777 | 0 |
| 0.7597222222222223 | 0 |
| 0.7604166666666666 | 0 |
| 0.7611111111111111 | 0 |
| 0.7618055555555556 | 0 |
| 0.7625000000000001 | 0 |
| 0.7631944444444444 | 0 |
| 0.7638888888888888 | 0 |
| 0.7645833333333334 | 0 |
| 0.7652777777777778 | 0 |
| 0.7659722222222222 | 0 |
| 0.7666666666666666 | 0 |
| 0.7673611111111112 | 0 |
| 0.7680555555555556 | 0 |
| 0.7687499999999999 | 0 |
| 0.7694444444444444 | 0 |
| 0.7701388888888889 | 0 |
| 0.7708333333333334 | 0 |
| 0.7715277777777777 | 0 |
| 0.7722222222222223 | 0 |
| 0.7729166666666667 | 0 |
| 0.7736111111111111 | 0 |
| 0.7743055555555555 | 0 |
| 0.775 | 0 |
| 0.7756944444444445 | 0 |
| 0.7763888888888889 | 0 |
| 0.7770833333333332 | 0 |
| 0.7777777777777778 | 0 |
| 0.7784722222222222 | 0 |
| 0.7791666666666667 | 0 |
| 0.779861111111111 | 0 |
| 0.7805555555555556 | 0 |
| 0.78125 | 0 |
| 0.7819444444444444 | 0 |
| 0.782638888888889 | 0 |
| 0.7833333333333333 | 0 |
| 0.7840277777777778 | 0 |
| 0.7847222222222222 | 0 |
| 0.7854166666666668 | 0 |
| 0.7861111111111111 | 0 |
| 0.7868055555555555 | 0 |
| 0.7875 | 0 |
| 0.7881944444444445 | 0 |
| 0.7888888888888889 | 0 |
| 0.7895833333333333 | 0 |
| 0.7902777777777777 | 0 |
| 0.7909722222222223 | 0 |
| 0.7916666666666666 | 0 |
| 0.7923611111111111 | 0 |
| 0.7930555555555556 | 0 |
| 0.7937500000000001 | 0 |
| 0.7944444444444444 | 0 |
| 0.7951388888888888 | 0 |
| 0.7958333333333334 | 0 |
| 0.7965277777777778 | 0 |
| 0.7972222222222222 | 0 |
| 0.7979166666666666 | 0 |
| 0.7986111111111112 | 0 |
| 0.7993055555555556 | 0 |
| 0.7999999999999999 | 0 |
| 0.8006944444444444 | 0 |
| 0.8013888888888889 | 0 |
| 0.8020833333333334 | 0 |
| 0.8027777777777777 | 0 |
| 0.8034722222222223 | 0 |
| 0.8041666666666667 | 0 |
| 0.8048611111111111 | 0 |
| 0.8055555555555555 | 0 |
| 0.80625 | 0 |
| 0.8069444444444445 | 0 |
| 0.8076388888888889 | 0 |
| 0.8083333333333332 | 0 |
| 0.8090277777777778 | 0 |
| 0.8097222222222222 | 0 |
| 0.8104166666666667 | 0 |
| 0.811111111111111 | 0 |
| 0.8118055555555556 | 0 |
| 0.8125 | 0 |
| 0.8131944444444444 | 0 |
| 0.813888888888889 | 0 |
| 0.8145833333333333 | 0 |
| 0.8152777777777778 | 0 |
| 0.8159722222222222 | 0 |
| 0.8166666666666668 | 0 |
| 0.8173611111111111 | 0 |
| 0.8180555555555555 | 0 |
| 0.81875 | 0 |
| 0.8194444444444445 | 0 |
| 0.8201388888888889 | 0 |
| 0.8208333333333333 | 0 |
| 0.8215277777777777 | 0 |
| 0.8222222222222223 | 0 |
| 0.8229166666666666 | 0 |
| 0.8236111111111111 | 0 |
| 0.8243055555555556 | 0 |
| 0.8250000000000001 | 0 |
| 0.8256944444444444 | 0 |
| 0.8263888888888888 | 0 |
| 0.8270833333333334 | 0 |
| 0.8277777777777778 | 0 |
| 0.8284722222222222 | 0 |
| 0.8291666666666666 | 0 |
| 0.8298611111111112 | 0 |
| 0.8305555555555556 | 0 |
| 0.8312499999999999 | 0 |
| 0.8319444444444444 | 0 |
| 0.8326388888888889 | 0 |
| 0.8333333333333334 | 0 |
| 0.8340277777777777 | 0 |
| 0.8347222222222223 | 0 |
| 0.8354166666666667 | 0 |
| 0.8361111111111111 | 0 |
| 0.8368055555555555 | 0 |
| 0.8375 | 0 |
| 0.8381944444444445 | 0 |
| 0.8388888888888889 | 0 |
| 0.8395833333333332 | 0 |
| 0.8402777777777778 | 0 |
| 0.8409722222222222 | 0 |
| 0.8416666666666667 | 0 |
| 0.842361111111111 | 0 |
| 0.8430555555555556 | 0 |
| 0.84375 | 0 |
| 0.8444444444444444 | 0 |
| 0.845138888888889 | 0 |
| 0.8458333333333333 | 0 |
| 0.8465277777777778 | 0 |
| 0.8472222222222222 | 0 |
| 0.8479166666666668 | 0 |
| 0.8486111111111111 | 0 |
| 0.8493055555555555 | 0 |
| 0.85 | 0 |
| 0.8506944444444445 | 0 |
| 0.8513888888888889 | 0 |
| 0.8520833333333333 | 0 |
| 0.8527777777777777 | 0 |
| 0.8534722222222223 | 0 |
| 0.8541666666666666 | 0 |
| 0.8548611111111111 | 0 |
| 0.8555555555555556 | 0 |
| 0.8562500000000001 | 0 |
| 0.8569444444444444 | 0 |
| 0.8576388888888888 | 0 |
| 0.8583333333333334 | 0 |
| 0.8590277777777778 | 0 |
| 0.8597222222222222 | 0 |
| 0.8604166666666666 | 0 |
| 0.8611111111111112 | 0 |
| 0.8618055555555556 | 0 |
| 0.8624999999999999 | 0 |
| 0.8631944444444444 | 0 |
| 0.8638888888888889 | 0 |
| 0.8645833333333334 | 0 |
| 0.8652777777777777 | 0 |
| 0.8659722222222223 | 0 |
| 0.8666666666666667 | 0 |
| 0.8673611111111111 | 0 |
| 0.8680555555555555 | 0 |
| 0.86875 | 0 |
| 0.8694444444444445 | 0 |
| 0.8701388888888889 | 0 |
| 0.8708333333333332 | 0 |
| 0.8715277777777778 | 0 |
| 0.8722222222222222 | 0 |
| 0.8729166666666667 | 0 |
| 0.873611111111111 | 0 |
| 0.8743055555555556 | 0 |
| 0.875 | 0 |
| 0.8756944444444444 | 0 |
| 0.876388888888889 | 0 |
| 0.8770833333333333 | 0 |
| 0.8777777777777778 | 0 |
| 0.8784722222222222 | 0 |
| 0.8791666666666668 | 0 |
| 0.8798611111111111 | 0 |
| 0.8805555555555555 | 0 |
| 0.88125 | 0 |
| 0.8819444444444445 | 0 |
| 0.8826388888888889 | 0 |
| 0.8833333333333333 | 0 |
| 0.8840277777777777 | 0 |
| 0.8847222222222223 | 0 |
| 0.8854166666666666 | 0 |
| 0.8861111111111111 | 0 |
| 0.8868055555555556 | 0 |
| 0.8875000000000001 | 0 |
| 0.8881944444444444 | 0 |
| 0.8888888888888888 | 0 |
| 0.8895833333333334 | 0 |
| 0.8902777777777778 | 0 |
| 0.8909722222222222 | 0 |
| 0.8916666666666666 | 0 |
| 0.8923611111111112 | 0 |
| 0.8930555555555556 | 0 |
| 0.8937499999999999 | 0 |
| 0.8944444444444444 | 0 |
| 0.8951388888888889 | 0 |
| 0.8958333333333334 | 0 |
| 0.8965277777777777 | 0 |
| 0.8972222222222223 | 0 |
| 0.8979166666666667 | 0 |
| 0.8986111111111111 | 0 |
| 0.8993055555555555 | 0 |
| 0.9 | 0 |
| 0.9006944444444445 | 0 |
| 0.9013888888888889 | 0 |
| 0.9020833333333332 | 0 |
| 0.9027777777777778 | 0 |
| 0.9034722222222222 | 0 |
| 0.9041666666666667 | 0 |
| 0.904861111111111 | 0 |
| 0.9055555555555556 | 0 |
| 0.90625 | 0 |
| 0.9069444444444444 | 0 |
| 0.907638888888889 | 0 |
| 0.9083333333333333 | 0 |
| 0.9090277777777778 | 0 |
| 0.9097222222222222 | 0 |
| 0.9104166666666668 | 0 |
| 0.9111111111111111 | 0 |
| 0.9118055555555555 | 0 |
| 0.9125 | 0 |
| 0.9131944444444445 | 0 |
| 0.9138888888888889 | 0 |
| 0.9145833333333333 | 0 |
| 0.9152777777777777 | 0 |
| 0.9159722222222223 | 0 |
| 0.9166666666666666 | 0 |
| 0.9173611111111111 | 0 |
| 0.9180555555555556 | 0 |
| 0.9187500000000001 | 0 |
| 0.9194444444444444 | 0 |
| 0.9201388888888888 | 0 |
| 0.9208333333333334 | 0 |
| 0.9215277777777778 | 0 |
| 0.9222222222222222 | 0 |
| 0.9229166666666666 | 0 |
| 0.9236111111111112 | 0 |
| 0.9243055555555556 | 0 |
| 0.9249999999999999 | 0 |
| 0.9256944444444444 | 0 |
| 0.9263888888888889 | 0 |
| 0.9270833333333334 | 0 |
| 0.9277777777777777 | 0 |
| 0.9284722222222223 | 0 |
| 0.9291666666666667 | 0 |
| 0.9298611111111111 | 0 |
| 0.9305555555555555 | 0 |
| 0.93125 | 0 |
| 0.9319444444444445 | 0 |
| 0.9326388888888889 | 0 |
| 0.9333333333333332 | 0 |
| 0.9340277777777778 | 0 |
| 0.9347222222222222 | 0 |
| 0.9354166666666667 | 0 |
| 0.936111111111111 | 0 |
| 0.9368055555555556 | 0 |
| 0.9375 | 0 |
| 0.9381944444444444 | 0 |
| 0.938888888888889 | 0 |
| 0.9395833333333333 | 0 |
| 0.9402777777777778 | 0 |
| 0.9409722222222222 | 0 |
| 0.9416666666666668 | 0 |
| 0.9423611111111111 | 0 |
| 0.9430555555555555 | 0 |
| 0.94375 | 0 |
| 0.9444444444444445 | 0 |
| 0.9451388888888889 | 0 |
| 0.9458333333333333 | 0 |
| 0.9465277777777777 | 0 |
| 0.9472222222222223 | 0 |
| 0.9479166666666666 | 0 |
| 0.9486111111111111 | 0 |
| 0.9493055555555556 | 0 |
| 0.9500000000000001 | 0 |
| 0.9506944444444444 | 0 |
| 0.9513888888888888 | 0 |
| 0.9520833333333334 | 0 |
| 0.9527777777777778 | 0 |
| 0.9534722222222222 | 0 |
| 0.9541666666666666 | 0 |
| 0.9548611111111112 | 0 |
| 0.9555555555555556 | 0 |
| 0.9562499999999999 | 0 |
| 0.9569444444444444 | 0 |
| 0.9576388888888889 | 0 |
| 0.9583333333333334 | 0 |
| 0.9590277777777777 | 0 |
| 0.9597222222222223 | 0 |
| 0.9604166666666667 | 0 |
| 0.9611111111111111 | 0 |
| 0.9618055555555555 | 0 |
| 0.9625 | 0 |
| 0.9631944444444445 | 0 |
| 0.9638888888888889 | 0 |
| 0.9645833333333332 | 0 |
| 0.9652777777777778 | 0 |
| 0.9659722222222222 | 0 |
| 0.9666666666666667 | 0 |
| 0.967361111111111 | 0 |
| 0.9680555555555556 | 0 |
| 0.96875 | 0 |
| 0.9694444444444444 | 0 |
| 0.970138888888889 | 0 |
| 0.9708333333333333 | 0 |
| 0.9715277777777778 | 0 |
| 0.9722222222222222 | 0 |
| 0.9729166666666668 | 0 |
| 0.9736111111111111 | 0 |
| 0.9743055555555555 | 0 |
| 0.975 | 0 |
| 0.9756944444444445 | 0 |
| 0.9763888888888889 | 0 |
| 0.9770833333333333 | 0 |
| 0.9777777777777777 | 0 |
| 0.9784722222222223 | 0 |
| 0.9791666666666666 | 0 |
| 0.9798611111111111 | 0 |
| 0.9805555555555556 | 0 |
| 0.9812500000000001 | 0 |
| 0.9819444444444444 | 0 |
| 0.9826388888888888 | 0 |
| 0.9833333333333334 | 0 |
| 0.9840277777777778 | 0 |
| 0.9847222222222222 | 0 |
| 0.9854166666666666 | 0 |
| 0.9861111111111112 | 0 |
| 0.9868055555555556 | 0 |
| 0.9874999999999999 | 0 |
| 0.9881944444444444 | 0 |
| 0.9888888888888889 | 0 |
| 0.9895833333333334 | 0 |
| 0.9902777777777777 | 0 |
| 0.9909722222222223 | 0 |
| 0.9916666666666667 | 0 |
| 0.9923611111111111 | 0 |
| 0.9930555555555555 | 0 |
| 0.99375 | 0 |
| 0.9944444444444445 | 0 |
| 0.9951388888888889 | 0 |
| 0.9958333333333332 | 0 |
| 0.9965277777777778 | 0 |
| 0.9972222222222222 | 0 |
| 0.9979166666666667 | 0 |
| 0.998611111111111 | 0 |
| 0.9993055555555556 | 0 |